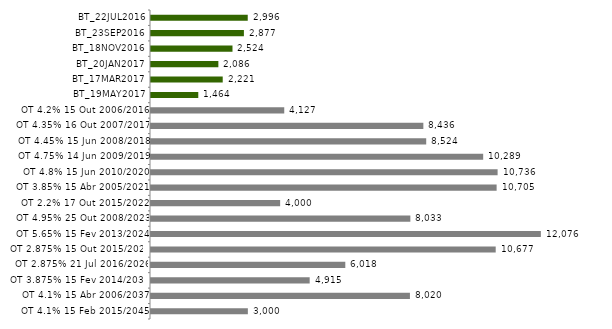
| Category | Series 0 |
|---|---|
| BT_22JUL2016 | 2996.46 |
| BT_23SEP2016 | 2877.408 |
| BT_18NOV2016 | 2524.031 |
| BT_20JAN2017 | 2086.37 |
| BT_17MAR2017 | 2221.441 |
| BT_19MAY2017 | 1464.402 |
| OT 4.2% 15 Out 2006/2016 | 4127.125 |
| OT 4.35% 16 Out 2007/2017 | 8435.713 |
| OT 4.45% 15 Jun 2008/2018 | 8524.245 |
| OT 4.75% 14 Jun 2009/2019 | 10288.75 |
| OT 4.8% 15 Jun 2010/2020 | 10735.8 |
| OT 3.85% 15 Abr 2005/2021 | 10705.158 |
| OT 2.2% 17 Out 2015/2022 | 4000 |
| OT 4.95% 25 Out 2008/2023 | 8032.963 |
| OT 5.65% 15 Fev 2013/2024 | 12075.636 |
| OT 2.875% 15 Out 2015/2025 | 10676.752 |
| OT 2.875% 21 Jul 2016/2026 | 6018.391 |
| OT 3.875% 15 Fev 2014/2030 | 4914.902 |
| OT 4.1% 15 Abr 2006/2037 | 8019.912 |
| OT 4.1% 15 Feb 2015/2045 | 3000 |